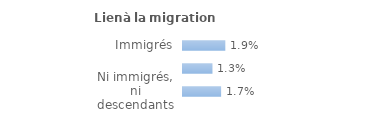
| Category | Series 0 |
|---|---|
| Immigrés | 0.019 |
| Descendants d'immigré(s) | 0.013 |
| Ni immigrés, ni descendants | 0.017 |